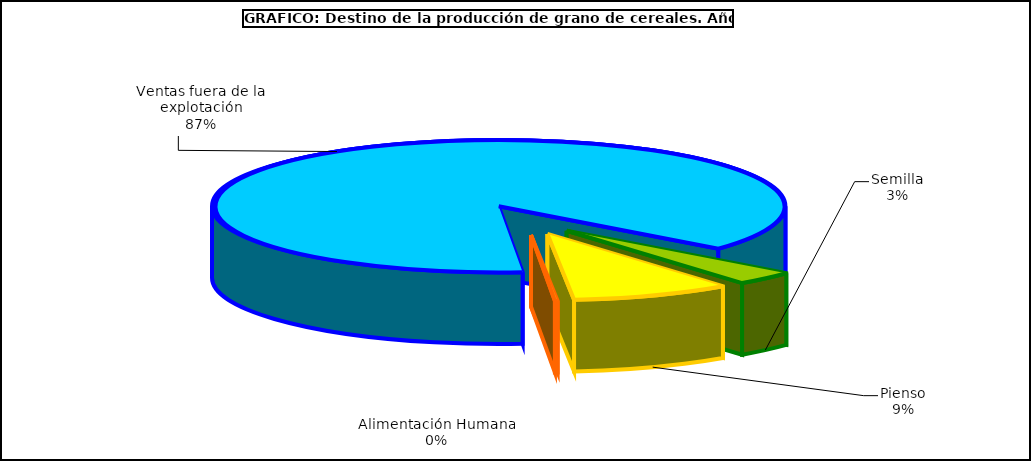
| Category | Series 0 |
|---|---|
| 0 | 685702 |
| 1 | 1813545 |
| 2 | 30277 |
| 3 | 17611419 |